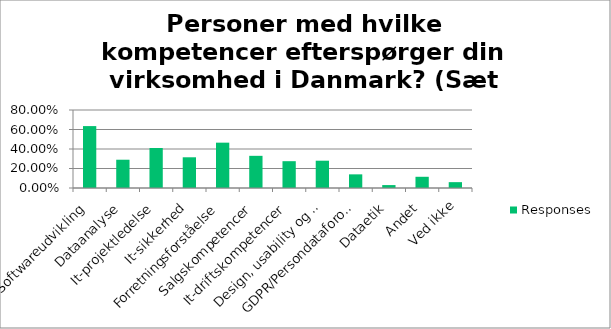
| Category | Responses |
|---|---|
| Softwareudvikling | 0.635 |
| Dataanalyse | 0.29 |
| It-projektledelse | 0.41 |
| It-sikkerhed | 0.315 |
| Forretningsforståelse | 0.465 |
| Salgskompetencer | 0.33 |
| It-driftskompetencer | 0.275 |
| Design, usability og UX | 0.28 |
| GDPR/Persondataforordningen | 0.14 |
| Dataetik | 0.03 |
| Andet | 0.115 |
| Ved ikke | 0.06 |